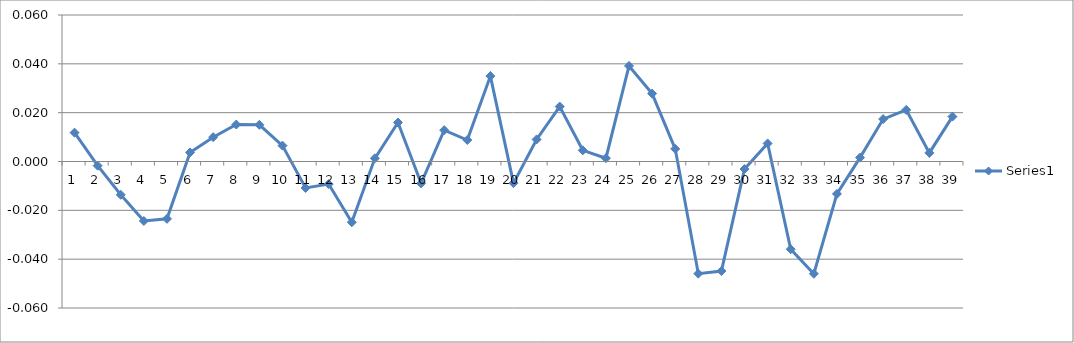
| Category | Series 0 |
|---|---|
| 0 | 0.012 |
| 1 | -0.002 |
| 2 | -0.014 |
| 3 | -0.024 |
| 4 | -0.023 |
| 5 | 0.004 |
| 6 | 0.01 |
| 7 | 0.015 |
| 8 | 0.015 |
| 9 | 0.006 |
| 10 | -0.011 |
| 11 | -0.009 |
| 12 | -0.025 |
| 13 | 0.001 |
| 14 | 0.016 |
| 15 | -0.009 |
| 16 | 0.013 |
| 17 | 0.009 |
| 18 | 0.035 |
| 19 | -0.009 |
| 20 | 0.009 |
| 21 | 0.023 |
| 22 | 0.005 |
| 23 | 0.001 |
| 24 | 0.039 |
| 25 | 0.028 |
| 26 | 0.005 |
| 27 | -0.046 |
| 28 | -0.045 |
| 29 | -0.003 |
| 30 | 0.007 |
| 31 | -0.036 |
| 32 | -0.046 |
| 33 | -0.013 |
| 34 | 0.002 |
| 35 | 0.017 |
| 36 | 0.021 |
| 37 | 0.004 |
| 38 | 0.018 |